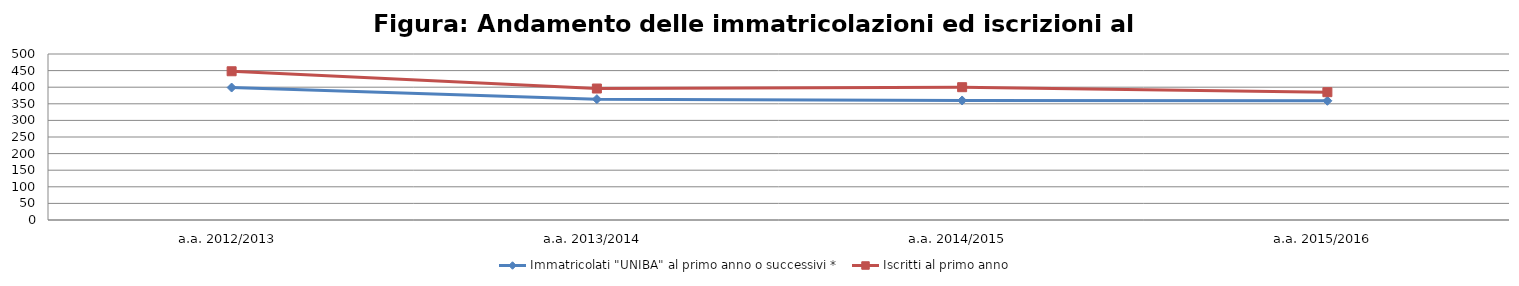
| Category | Immatricolati "UNIBA" al primo anno o successivi * | Iscritti al primo anno  |
|---|---|---|
| a.a. 2012/2013 | 399 | 448 |
| a.a. 2013/2014 | 364 | 396 |
| a.a. 2014/2015 | 360 | 400 |
| a.a. 2015/2016 | 359 | 385 |